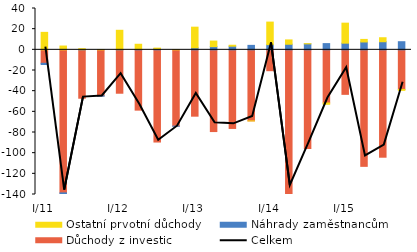
| Category | Důchody z investic | Náhrady zaměstnancům | Ostatní prvotní důchody |
|---|---|---|---|
| I/11 | -13.01 | -1.179 | 16.905 |
| II | -138.45 | -0.898 | 3.673 |
| III | -46.828 | 0.182 | 0.917 |
| IV | -44.5 | -0.359 | 0.201 |
| I/12 | -41.994 | 0.227 | 18.684 |
| II | -58.363 | 0.336 | 5.046 |
| III | -89.224 | 1.034 | 0.625 |
| IV | -73.825 | -0.116 | 0.042 |
| I/13 | -64.207 | 1.936 | 19.989 |
| II | -79.099 | 3.108 | 5.367 |
| III | -76.077 | 3.539 | 0.9 |
| IV | -68.775 | 4.321 | -0.021 |
| I/14 | -20.193 | 5.021 | 21.825 |
| II | -140.87 | 5.405 | 4.194 |
| III | -95.441 | 5.79 | 0.166 |
| IV | -51.417 | 6.025 | -1.284 |
| I/15 | -43.078 | 6.452 | 19.364 |
| II | -112.759 | 7.619 | 2.466 |
| III | -103.914 | 7.842 | 3.856 |
| IV | -38.326 | 7.856 | -0.894 |